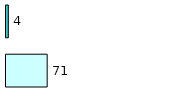
| Category | Series 0 | Series 1 |
|---|---|---|
| 0 | 71 | 4 |